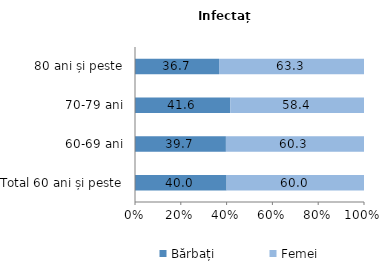
| Category | Bărbați | Femei |
|---|---|---|
| Total 60 ani și peste | 40 | 60 |
| 60-69 ani | 39.7 | 60.3 |
| 70-79 ani | 41.6 | 58.4 |
| 80 ani și peste | 36.7 | 63.3 |